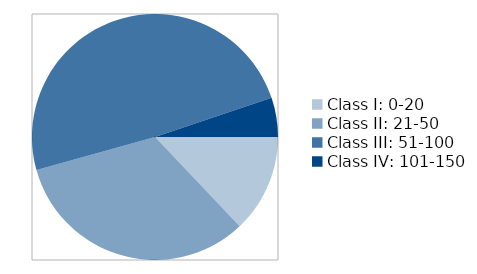
| Category | Or-R |
|---|---|
| Class I: 0-20 | 15 |
| Class II: 21-50 | 38 |
| Class III: 51-100 | 57 |
| Class IV: 101-150 | 6 |